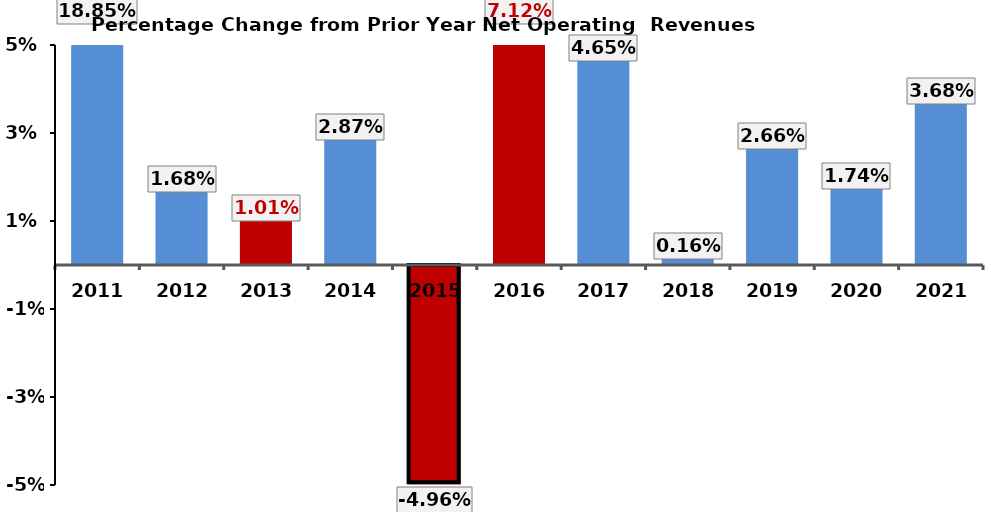
| Category | % Change from Prior Years |
|---|---|
| 2011.0 | 0.188 |
| 2012.0 | 0.017 |
| 2013.0 | 0.01 |
| 2014.0 | 0.029 |
| 2015.0 | -0.05 |
| 2016.0 | 0.071 |
| 2017.0 | 0.046 |
| 2018.0 | 0.002 |
| 2019.0 | 0.027 |
| 2020.0 | 0.017 |
| 2021.0 | 0.037 |